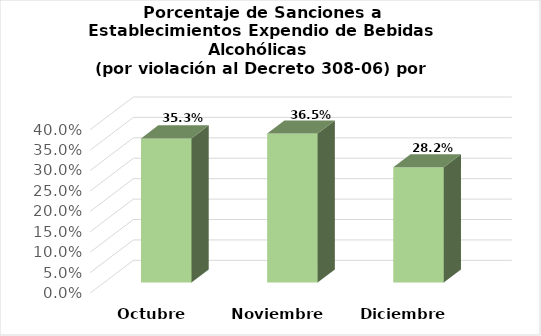
| Category | Series 0 |
|---|---|
| Octubre | 0.353 |
| Noviembre | 0.365 |
| Diciembre | 0.282 |